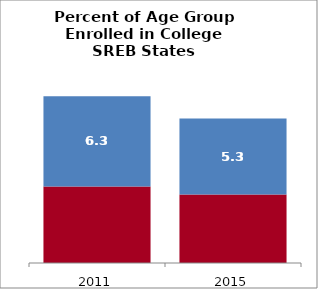
| Category | 18 to 24 | 25 to 49 |
|---|---|---|
| 2011.0 | 35.301 | 6.259 |
| 2015.0 | 34.75 | 5.256 |